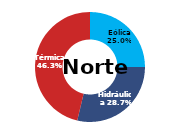
| Category | Norte |
|---|---|
| Eólica | 77.929 |
| Hidráulica | 89.599 |
| Solar | 0 |
| Térmica | 144.283 |